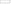
| Category | Net Immigration | Natural Increase (births minus deaths) |
|---|---|---|
| 0 | 1173752 | 1628183 |
| 1 | 1051264 | 1576760 |
| 2 | 795360 | 1630368 |
| 3 | 959123 | 1663566 |
| 4 | 921226 | 1688679 |
| 5 | 979817 | 1759544 |
| 6 | 839835 | 1879936 |
| 7 | 823735 | 1871255 |
| 8 | 725530 | 1753359 |
| 9 | 735268 | 1659257 |
| 10 | 795295 | 1461043 |
| 11 | 858736 | 1435445 |
| 12 | 849728 | 1332557 |
| 13 | 945635 | 1380747 |
| 14 | 1060115 | 1292550 |
| 15 | 1065017 | 1267744 |
| 16 | 948392 | 1101981 |
| 17 | 719871 | 996200 |
| 18 | 568639 | 923115 |
| 19 | 477029 | 677141 |
| 20 | 376008 | 146036 |
| 21 | 999267 | 223167 |